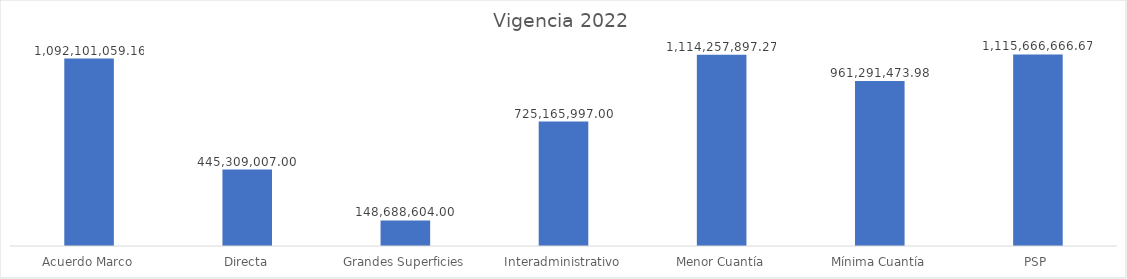
| Category | Total |
|---|---|
| Acuerdo Marco | 1092101059.16 |
| Directa | 445309007 |
| Grandes Superficies | 148688604 |
| Interadministrativo | 725165997 |
| Menor Cuantía | 1114257897.27 |
| Mínima Cuantía | 961291473.98 |
| PSP | 1115666666.67 |